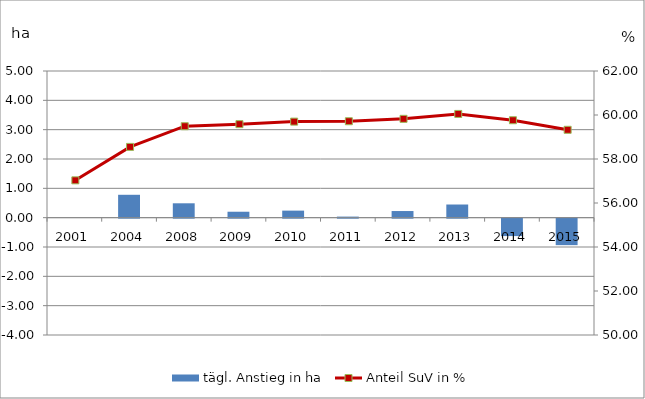
| Category | tägl. Anstieg in ha |
|---|---|
| 2001 | 0 |
| 2004 | 0.78 |
| 2008 | 0.49 |
| 2009 | 0.202 |
| 2010 | 0.24 |
| 2011 | 0.036 |
| 2012 | 0.226 |
| 2013 | 0.449 |
| 2014 | -0.594 |
| 2015 | -0.903 |